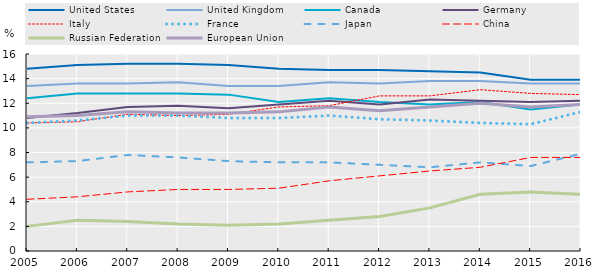
| Category | United States | United Kingdom | Canada | Germany | Italy | France | Japan | China | Russian Federation | European Union  |
|---|---|---|---|---|---|---|---|---|---|---|
| 2005.0 | 14.8 | 13.4 | 12.4 | 10.8 | 10.4 | 10.4 | 7.2 | 4.2 | 2 | 10.9 |
| 2006.0 | 15.1 | 13.6 | 12.8 | 11.2 | 10.5 | 10.6 | 7.3 | 4.4 | 2.5 | 11 |
| 2007.0 | 15.2 | 13.6 | 12.8 | 11.7 | 11.1 | 11 | 7.8 | 4.8 | 2.4 | 11.3 |
| 2008.0 | 15.2 | 13.7 | 12.8 | 11.8 | 11 | 11 | 7.6 | 5 | 2.2 | 11.2 |
| 2009.0 | 15.1 | 13.4 | 12.7 | 11.6 | 11.1 | 10.8 | 7.3 | 5 | 2.1 | 11.2 |
| 2010.0 | 14.8 | 13.4 | 12.1 | 11.9 | 11.7 | 10.8 | 7.2 | 5.1 | 2.2 | 11.3 |
| 2011.0 | 14.7 | 13.7 | 12.4 | 12.2 | 11.8 | 11 | 7.2 | 5.7 | 2.5 | 11.7 |
| 2012.0 | 14.7 | 13.6 | 12.1 | 11.9 | 12.6 | 10.7 | 7 | 6.1 | 2.8 | 11.4 |
| 2013.0 | 14.6 | 13.8 | 11.9 | 12.3 | 12.6 | 10.6 | 6.8 | 6.5 | 3.5 | 11.7 |
| 2014.0 | 14.5 | 13.8 | 12.1 | 12.2 | 13.1 | 10.4 | 7.2 | 6.8 | 4.6 | 12 |
| 2015.0 | 13.9 | 13.6 | 11.5 | 12.1 | 12.8 | 10.3 | 6.9 | 7.6 | 4.8 | 11.7 |
| 2016.0 | 13.9 | 13.6 | 11.9 | 12.2 | 12.7 | 11.3 | 7.9 | 7.6 | 4.6 | 11.9 |